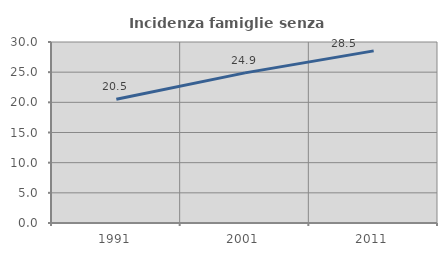
| Category | Incidenza famiglie senza nuclei |
|---|---|
| 1991.0 | 20.505 |
| 2001.0 | 24.88 |
| 2011.0 | 28.527 |